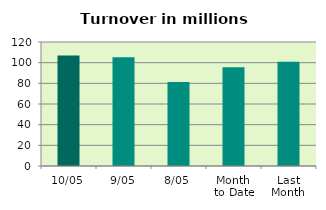
| Category | Series 0 |
|---|---|
| 10/05 | 106.896 |
| 9/05 | 105.352 |
| 8/05 | 81.219 |
| Month 
to Date | 95.682 |
| Last
Month | 100.792 |